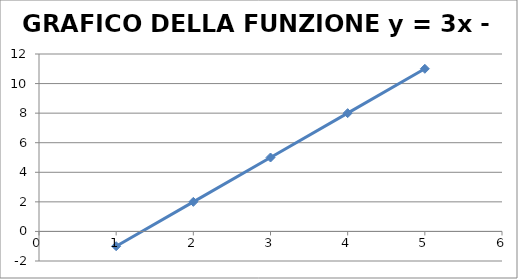
| Category | GRAFICO DELLA FUNZIONE y = 3x - 4 Y |
|---|---|
| 1.0 | -1 |
| 2.0 | 2 |
| 3.0 | 5 |
| 4.0 | 8 |
| 5.0 | 11 |